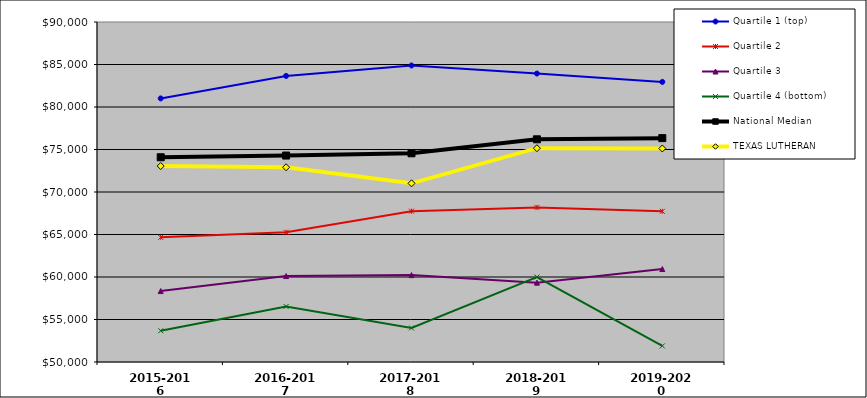
| Category | Quartile 1 (top) | Quartile 2 | Quartile 3 | Quartile 4 (bottom) | National Median | TEXAS LUTHERAN |
|---|---|---|---|---|---|---|
| 2015-2016 | 81009 | 64665 | 58347 | 53676 | 74088 | 73053 |
| 2016-2017 | 83652 | 65258 | 60112 | 56533 | 74288 | 72909 |
| 2017-2018 | 84883 | 67743 | 60221.5 | 54000 | 74555 | 71021 |
| 2018-2019 | 83935 | 68191 | 59337 | 60000 | 76199 | 75154 |
| 2019-2020 | 82953 | 67727 | 60937.5 | 51892 | 76337 | 75120 |